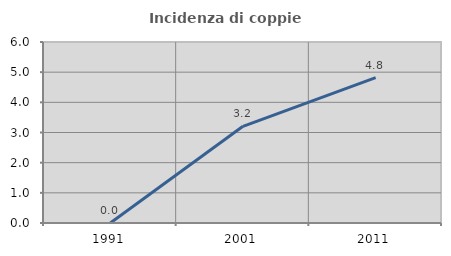
| Category | Incidenza di coppie miste |
|---|---|
| 1991.0 | 0 |
| 2001.0 | 3.205 |
| 2011.0 | 4.819 |